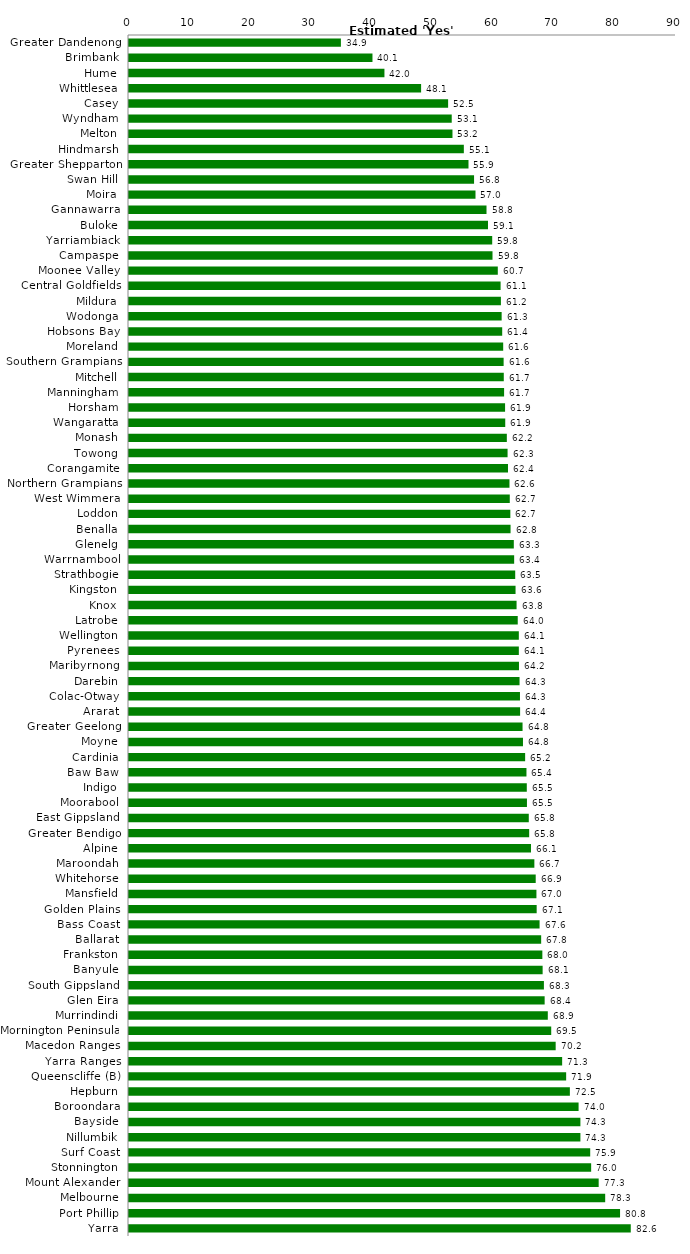
| Category | Series 0 |
|---|---|
| Greater Dandenong | 34.863 |
| Brimbank | 40.059 |
| Hume | 42.029 |
| Whittlesea | 48.061 |
| Casey | 52.506 |
| Wyndham | 53.1 |
| Melton | 53.222 |
| Hindmarsh | 55.093 |
| Greater Shepparton | 55.859 |
| Swan Hill | 56.774 |
| Moira | 57.01 |
| Gannawarra | 58.822 |
| Buloke | 59.067 |
| Yarriambiack | 59.76 |
| Campaspe | 59.81 |
| Moonee Valley | 60.681 |
| Central Goldfields | 61.141 |
| Mildura | 61.191 |
| Wodonga | 61.314 |
| Hobsons Bay | 61.405 |
| Moreland | 61.568 |
| Southern Grampians | 61.639 |
| Mitchell | 61.665 |
| Manningham | 61.716 |
| Horsham | 61.877 |
| Wangaratta | 61.905 |
| Monash | 62.167 |
| Towong | 62.288 |
| Corangamite | 62.357 |
| Northern Grampians | 62.6 |
| West Wimmera | 62.651 |
| Loddon | 62.744 |
| Benalla | 62.779 |
| Glenelg | 63.314 |
| Warrnambool | 63.372 |
| Strathbogie | 63.545 |
| Kingston | 63.6 |
| Knox | 63.769 |
| Latrobe | 63.961 |
| Wellington | 64.14 |
| Pyrenees | 64.141 |
| Maribyrnong | 64.164 |
| Darebin | 64.258 |
| Colac-Otway | 64.328 |
| Ararat | 64.351 |
| Greater Geelong | 64.752 |
| Moyne | 64.823 |
| Cardinia | 65.179 |
| Baw Baw | 65.396 |
| Indigo | 65.451 |
| Moorabool | 65.476 |
| East Gippsland | 65.778 |
| Greater Bendigo | 65.843 |
| Alpine | 66.14 |
| Maroondah | 66.696 |
| Whitehorse | 66.918 |
| Mansfield | 67.037 |
| Golden Plains | 67.075 |
| Bass Coast | 67.554 |
| Ballarat | 67.815 |
| Frankston | 68.01 |
| Banyule | 68.057 |
| South Gippsland | 68.266 |
| Glen Eira | 68.388 |
| Murrindindi | 68.907 |
| Mornington Peninsula | 69.47 |
| Macedon Ranges | 70.201 |
| Yarra Ranges | 71.268 |
| Queenscliffe (B) | 71.927 |
| Hepburn | 72.538 |
| Boroondara | 73.972 |
| Bayside | 74.271 |
| Nillumbik | 74.272 |
| Surf Coast | 75.883 |
| Stonnington | 76.041 |
| Mount Alexander | 77.278 |
| Melbourne | 78.349 |
| Port Phillip | 80.796 |
| Yarra | 82.557 |